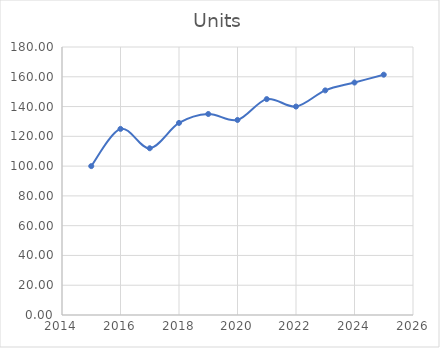
| Category | Units |
|---|---|
| 2015.0 | 100 |
| 2016.0 | 125 |
| 2017.0 | 112 |
| 2018.0 | 129 |
| 2019.0 | 135 |
| 2020.0 | 131 |
| 2021.0 | 145 |
| 2022.0 | 140 |
| 2023.0 | 150.857 |
| 2024.0 | 156.131 |
| 2025.0 | 161.405 |